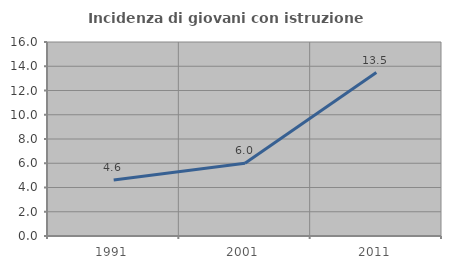
| Category | Incidenza di giovani con istruzione universitaria |
|---|---|
| 1991.0 | 4.615 |
| 2001.0 | 6 |
| 2011.0 | 13.483 |